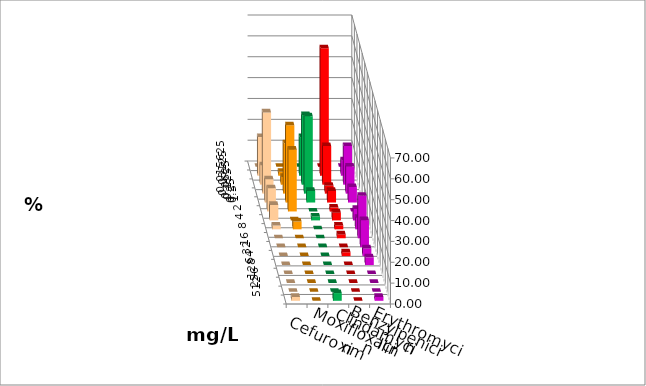
| Category | Cefuroxim | Moxifloxacin | Clindamycin | Benzylpenicillin | Erythromycin |
|---|---|---|---|---|---|
| 0.015625 | 0 | 0 | 0 | 0 | 0 |
| 0.03125 | 18.519 | 1.852 | 18.519 | 61.111 | 7.407 |
| 0.0625 | 9.259 | 3.704 | 33.333 | 18.519 | 18.519 |
| 0.125 | 38.889 | 24.074 | 37.037 | 3.704 | 12.963 |
| 0.25 | 11.111 | 37.037 | 5.556 | 5.556 | 7.407 |
| 0.5 | 11.111 | 29.63 | 0 | 1.852 | 0 |
| 1.0 | 7.407 | 0 | 1.852 | 3.704 | 5.556 |
| 2.0 | 1.852 | 3.704 | 0 | 1.852 | 5.556 |
| 4.0 | 0 | 0 | 0 | 1.852 | 20.37 |
| 8.0 | 0 | 0 | 0 | 0 | 12.963 |
| 16.0 | 0 | 0 | 0 | 1.852 | 3.704 |
| 32.0 | 0 | 0 | 0 | 0 | 3.704 |
| 64.0 | 0 | 0 | 0 | 0 | 0 |
| 128.0 | 0 | 0 | 0 | 0 | 0 |
| 256.0 | 0 | 0 | 0 | 0 | 0 |
| 512.0 | 1.852 | 0 | 3.704 | 0 | 1.852 |